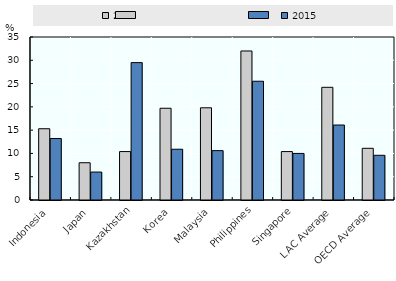
| Category | 2000 | 2015 |
|---|---|---|
| Indonesia | 15.3 | 13.2 |
| Japan | 8 | 6 |
| Kazakhstan | 10.4 | 29.5 |
| Korea | 19.7 | 10.9 |
| Malaysia | 19.8 | 10.6 |
| Philippines | 32 | 25.5 |
| Singapore | 10.4 | 10 |
| LAC Average | 24.2 | 16.1 |
| OECD Average | 11.1 | 9.6 |